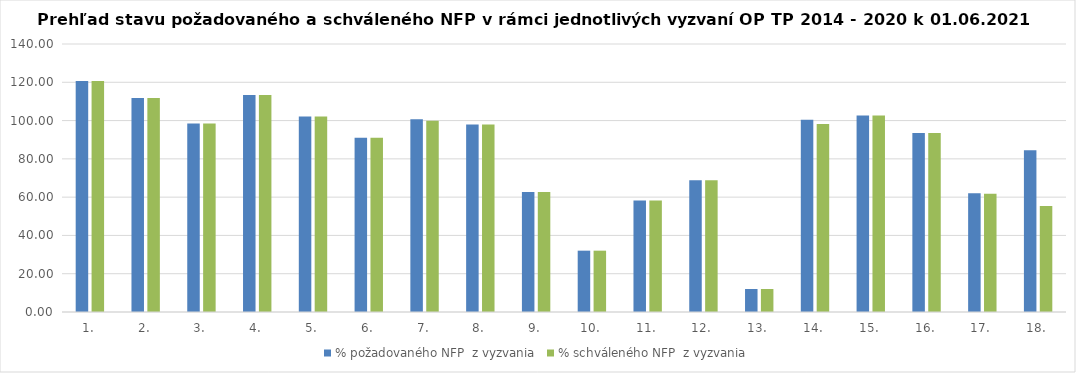
| Category | % požadovaného NFP  z vyzvania | % schváleného NFP  z vyzvania |
|---|---|---|
| 1. | 120.662 | 120.662 |
| 2. | 111.83 | 111.83 |
| 3. | 98.465 | 98.465 |
| 4. | 113.295 | 113.295 |
| 5. | 102.19 | 102.19 |
| 6. | 91.016 | 91.016 |
| 7. | 100.637 | 99.954 |
| 8. | 97.989 | 97.989 |
| 9. | 62.721 | 62.721 |
| 10. | 32.038 | 32.038 |
| 11. | 58.283 | 58.283 |
| 12. | 68.88 | 68.88 |
| 13. | 12.008 | 12.008 |
| 14. | 100.434 | 98.273 |
| 15. | 102.693 | 102.693 |
| 16. | 93.51 | 93.51 |
| 17. | 61.969 | 61.754 |
| 18. | 84.514 | 55.313 |